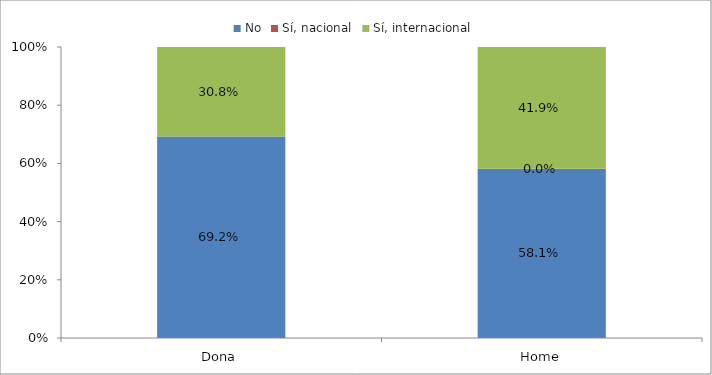
| Category | No | Sí, nacional | Sí, internacional |
|---|---|---|---|
| Dona | 0.692 | 0 | 0.308 |
| Home | 0.581 | 0 | 0.419 |